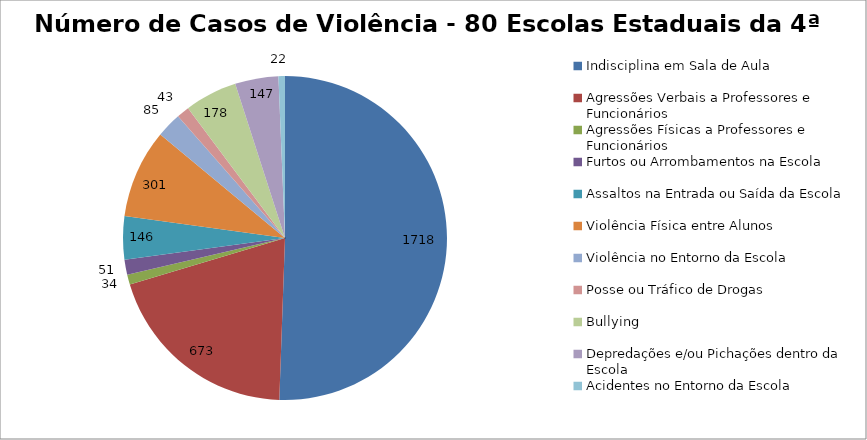
| Category | Número de Casos |
|---|---|
| Indisciplina em Sala de Aula | 1718 |
| Agressões Verbais a Professores e Funcionários | 673 |
| Agressões Físicas a Professores e Funcionários | 34 |
| Furtos ou Arrombamentos na Escola | 51 |
| Assaltos na Entrada ou Saída da Escola | 146 |
| Violência Física entre Alunos | 301 |
| Violência no Entorno da Escola | 85 |
| Posse ou Tráfico de Drogas | 43 |
| Bullying | 178 |
| Depredações e/ou Pichações dentro da Escola | 147 |
| Acidentes no Entorno da Escola | 22 |